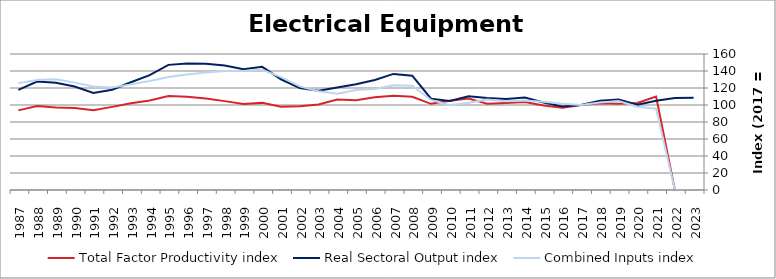
| Category | Total Factor Productivity index | Real Sectoral Output index | Combined Inputs index |
|---|---|---|---|
| 2023.0 | 0 | 108.399 | 0 |
| 2022.0 | 0 | 108.18 | 0 |
| 2021.0 | 109.942 | 105.081 | 95.578 |
| 2020.0 | 102.362 | 100.334 | 98.019 |
| 2019.0 | 101.505 | 106.364 | 104.787 |
| 2018.0 | 101.93 | 104.878 | 102.892 |
| 2017.0 | 100 | 100 | 100 |
| 2016.0 | 96.751 | 98.266 | 101.566 |
| 2015.0 | 99.304 | 102.971 | 103.693 |
| 2014.0 | 103.538 | 108.9 | 105.179 |
| 2013.0 | 102.38 | 106.966 | 104.48 |
| 2012.0 | 101.579 | 108.212 | 106.53 |
| 2011.0 | 107.523 | 110.329 | 102.61 |
| 2010.0 | 104.931 | 104.78 | 99.856 |
| 2009.0 | 101.359 | 107.391 | 105.951 |
| 2008.0 | 109.706 | 134.532 | 122.63 |
| 2007.0 | 110.906 | 136.57 | 123.14 |
| 2006.0 | 109.021 | 129.446 | 118.735 |
| 2005.0 | 105.66 | 124.337 | 117.676 |
| 2004.0 | 106.369 | 120.575 | 113.355 |
| 2003.0 | 100.517 | 116.744 | 116.144 |
| 2002.0 | 98.417 | 119.998 | 121.928 |
| 2001.0 | 98.075 | 130.289 | 132.846 |
| 2000.0 | 102.494 | 144.939 | 141.412 |
| 1999.0 | 101.323 | 141.94 | 140.088 |
| 1998.0 | 104.553 | 146.353 | 139.98 |
| 1997.0 | 107.512 | 148.527 | 138.15 |
| 1996.0 | 109.624 | 148.934 | 135.859 |
| 1995.0 | 110.632 | 147.204 | 133.057 |
| 1994.0 | 105.372 | 135.169 | 128.278 |
| 1993.0 | 102.043 | 126.82 | 124.282 |
| 1992.0 | 97.794 | 117.903 | 120.562 |
| 1991.0 | 93.791 | 114.2 | 121.76 |
| 1990.0 | 96.433 | 121.829 | 126.336 |
| 1989.0 | 97.018 | 126.295 | 130.177 |
| 1988.0 | 98.744 | 127.678 | 129.302 |
| 1987.0 | 93.688 | 117.812 | 125.75 |